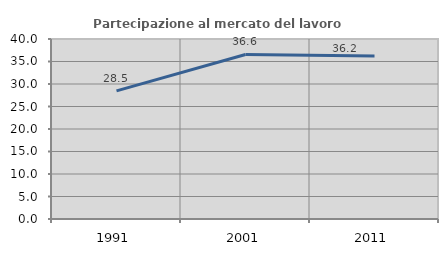
| Category | Partecipazione al mercato del lavoro  femminile |
|---|---|
| 1991.0 | 28.475 |
| 2001.0 | 36.568 |
| 2011.0 | 36.232 |